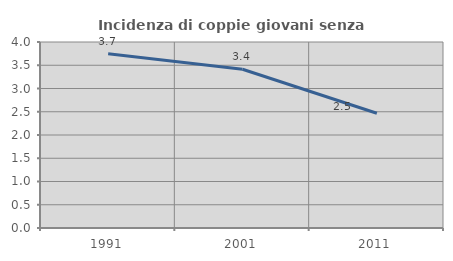
| Category | Incidenza di coppie giovani senza figli |
|---|---|
| 1991.0 | 3.745 |
| 2001.0 | 3.414 |
| 2011.0 | 2.469 |